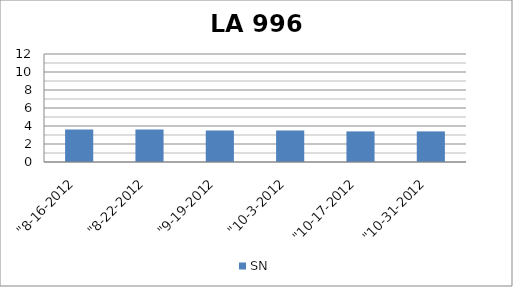
| Category | SN |
|---|---|
| "8-16-2012 | 3.6 |
| "8-22-2012 | 3.6 |
| "9-19-2012 | 3.5 |
| "10-3-2012 | 3.5 |
| "10-17-2012 | 3.4 |
| "10-31-2012 | 3.4 |